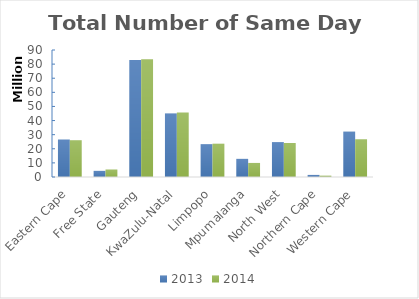
| Category | 2013 | 2014 |
|---|---|---|
| Eastern Cape | 26579000 | 26068000 |
| Free State | 4354000 | 5325000 |
| Gauteng | 82934000 | 83410000 |
| KwaZulu-Natal | 45083000 | 45747000 |
| Limpopo | 23283000 | 23582000 |
| Mpumalanga | 12857000 | 9967000 |
| North West | 24737000 | 24089000 |
| Northern Cape | 1481000 | 934000 |
| Western Cape | 32155000 | 26748000 |